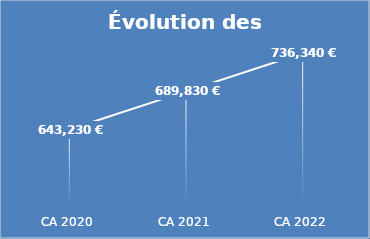
| Category | Totaux |
|---|---|
| CA 2020 | 643230 |
| CA 2021 | 689830 |
| CA 2022 | 736340 |